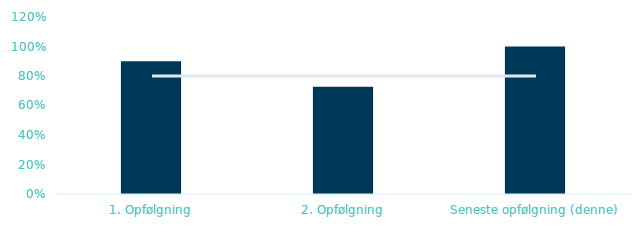
| Category | Series 0 |
|---|---|
| 1. Opfølgning | 0.9 |
| 2. Opfølgning | 0.727 |
| Seneste opfølgning (denne) | 1 |